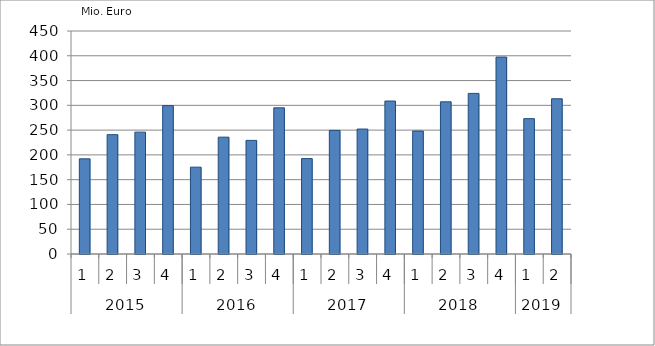
| Category | Ausbaugewerblicher Umsatz3 |
|---|---|
| 0 | 192043.756 |
| 1 | 240826.879 |
| 2 | 245916.087 |
| 3 | 299455.378 |
| 4 | 175225.59 |
| 5 | 235781.631 |
| 6 | 229227.559 |
| 7 | 294992.157 |
| 8 | 192499.539 |
| 9 | 249394.388 |
| 10 | 252146.755 |
| 11 | 308653.153 |
| 12 | 248133.418 |
| 13 | 307099.899 |
| 14 | 324088.989 |
| 15 | 397377.201 |
| 16 | 273159.137 |
| 17 | 313254.251 |